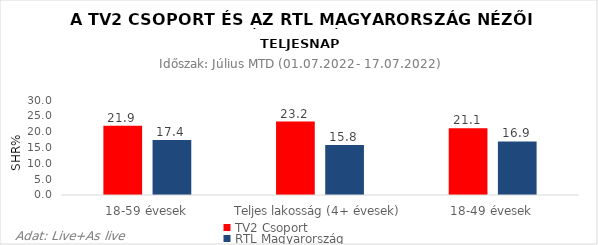
| Category | TV2 Csoport | RTL Magyarország |
|---|---|---|
| 18-59 évesek | 21.9 | 17.4 |
| Teljes lakosság (4+ évesek) | 23.2 | 15.8 |
| 18-49 évesek | 21.1 | 16.9 |